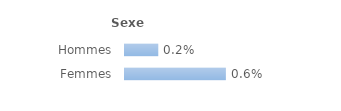
| Category | Series 0 |
|---|---|
| Hommes | 0.002 |
| Femmes | 0.006 |